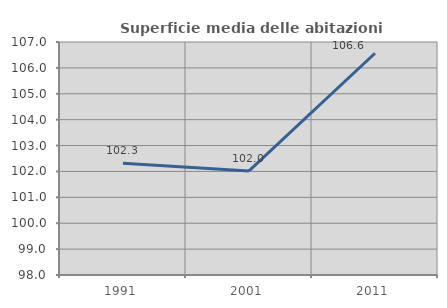
| Category | Superficie media delle abitazioni occupate |
|---|---|
| 1991.0 | 102.317 |
| 2001.0 | 102.021 |
| 2011.0 | 106.565 |